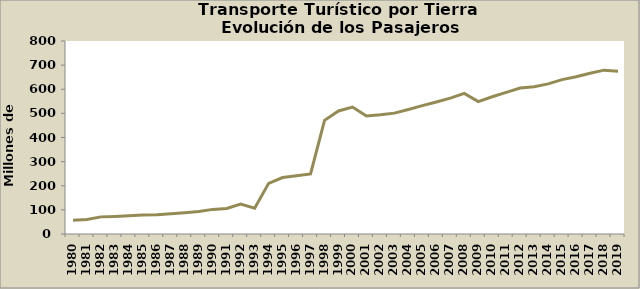
| Category | Series 0 |
|---|---|
| 1980.0 | 57 |
| 1981.0 | 60 |
| 1982.0 | 71 |
| 1983.0 | 73 |
| 1984.0 | 76 |
| 1985.0 | 79 |
| 1986.0 | 80 |
| 1987.0 | 84 |
| 1988.0 | 88 |
| 1989.0 | 93 |
| 1990.0 | 102 |
| 1991.0 | 106 |
| 1992.0 | 124 |
| 1993.0 | 107 |
| 1994.0 | 210 |
| 1995.0 | 234 |
| 1996.0 | 241 |
| 1997.0 | 249 |
| 1998.0 | 471 |
| 1999.0 | 510 |
| 2000.0 | 526 |
| 2001.0 | 489 |
| 2002.0 | 494 |
| 2003.0 | 501 |
| 2004.0 | 516 |
| 2005.0 | 532 |
| 2006.0 | 547 |
| 2007.0 | 563 |
| 2008.0 | 583 |
| 2009.0 | 549 |
| 2010.0 | 569 |
| 2011.0 | 587 |
| 2012.0 | 605 |
| 2013.0 | 610 |
| 2014.0 | 622.205 |
| 2015.0 | 640 |
| 2016.0 | 652.14 |
| 2017.0 | 666.18 |
| 2018.0 | 679.14 |
| 2019.0 | 674.82 |